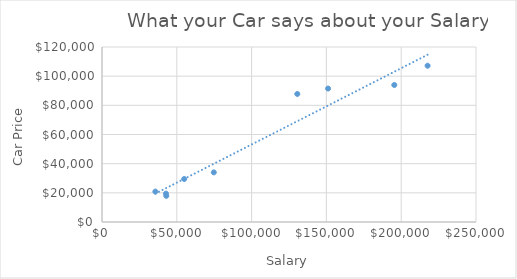
| Category | Y (Car Price) |
|---|---|
| 42763.0 | 19455 |
| 195387.0 | 93965 |
| 35672.0 | 20858 |
| 217637.0 | 107164 |
| 74734.0 | 34036 |
| 130550.0 | 87806 |
| 42976.0 | 17927 |
| 151132.0 | 91518 |
| 54936.0 | 29479 |